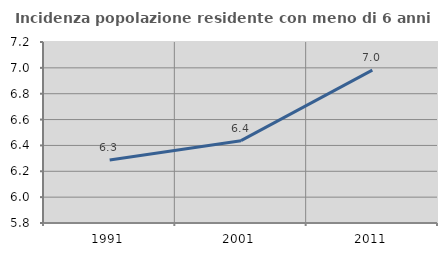
| Category | Incidenza popolazione residente con meno di 6 anni |
|---|---|
| 1991.0 | 6.288 |
| 2001.0 | 6.437 |
| 2011.0 | 6.982 |